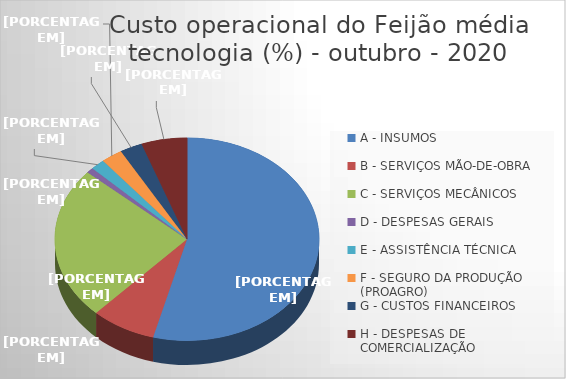
| Category | Series 0 |
|---|---|
| A - INSUMOS | 54.121 |
| B - SERVIÇOS MÃO-DE-OBRA | 7.922 |
| C - SERVIÇOS MECÂNICOS | 24.391 |
| D - DESPESAS GERAIS  | 0.864 |
| E - ASSISTÊNCIA TÉCNICA | 1.746 |
| F - SEGURO DA PRODUÇÃO (PROAGRO) | 2.619 |
| G - CUSTOS FINANCEIROS | 2.75 |
| H - DESPESAS DE COMERCIALIZAÇÃO | 5.588 |